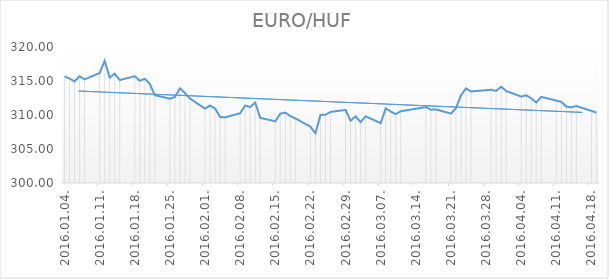
| Category | Series 0 |
|---|---|
| 2016-01-04 | 315.68 |
| 2016-01-05 | 315.37 |
| 2016-01-06 | 314.94 |
| 2016-01-07 | 315.7 |
| 2016-01-08 | 315.24 |
| 2016-01-11 | 316.17 |
| 2016-01-12 | 317.97 |
| 2016-01-13 | 315.51 |
| 2016-01-14 | 316.08 |
| 2016-01-15 | 315.14 |
| 2016-01-18 | 315.7 |
| 2016-01-19 | 315.03 |
| 2016-01-20 | 315.32 |
| 2016-01-21 | 314.57 |
| 2016-01-22 | 312.92 |
| 2016-01-25 | 312.4 |
| 2016-01-26 | 312.65 |
| 2016-01-27 | 313.92 |
| 2016-01-28 | 313.23 |
| 2016-01-29 | 312.42 |
| 2016-02-01 | 310.93 |
| 2016-02-02 | 311.4 |
| 2016-02-03 | 310.95 |
| 2016-02-04 | 309.71 |
| 2016-02-05 | 309.66 |
| 2016-02-08 | 310.25 |
| 2016-02-09 | 311.4 |
| 2016-02-10 | 311.17 |
| 2016-02-11 | 311.83 |
| 2016-02-12 | 309.58 |
| 2016-02-15 | 309.07 |
| 2016-02-16 | 310.2 |
| 2016-02-17 | 310.35 |
| 2016-02-18 | 309.85 |
| 2016-02-19 | 309.5 |
| 2016-02-22 | 308.29 |
| 2016-02-23 | 307.31 |
| 2016-02-24 | 310.01 |
| 2016-02-25 | 310.04 |
| 2016-02-26 | 310.45 |
| 2016-02-29 | 310.75 |
| 2016-03-01 | 309.16 |
| 2016-03-02 | 309.8 |
| 2016-03-03 | 308.95 |
| 2016-03-04 | 309.81 |
| 2016-03-07 | 308.8 |
| 2016-03-08 | 310.98 |
| 2016-03-09 | 310.5 |
| 2016-03-10 | 310.13 |
| 2016-03-11 | 310.55 |
| 2016-03-16 | 311.17 |
| 2016-03-17 | 310.78 |
| 2016-03-18 | 310.82 |
| 2016-03-21 | 310.21 |
| 2016-03-22 | 311 |
| 2016-03-23 | 312.91 |
| 2016-03-24 | 313.91 |
| 2016-03-25 | 313.46 |
| 2016-03-29 | 313.71 |
| 2016-03-30 | 313.55 |
| 2016-03-31 | 314.16 |
| 2016-04-01 | 313.53 |
| 2016-04-04 | 312.71 |
| 2016-04-05 | 312.9 |
| 2016-04-06 | 312.45 |
| 2016-04-07 | 311.84 |
| 2016-04-08 | 312.67 |
| 2016-04-11 | 312.11 |
| 2016-04-12 | 311.94 |
| 2016-04-13 | 311.22 |
| 2016-04-14 | 311.14 |
| 2016-04-15 | 311.32 |
| 2016-04-18 | 310.6 |
| 2016-04-19 | 310.35 |